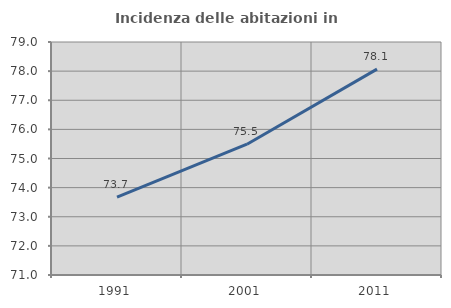
| Category | Incidenza delle abitazioni in proprietà  |
|---|---|
| 1991.0 | 73.671 |
| 2001.0 | 75.49 |
| 2011.0 | 78.07 |